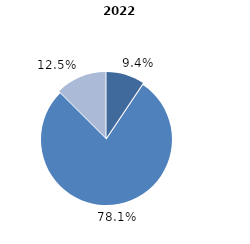
| Category | 2022 |
|---|---|
| cercetare fundamentală | 9.4 |
| cercetare aplicativă | 78.1 |
| dezvoltare experimentală | 12.5 |